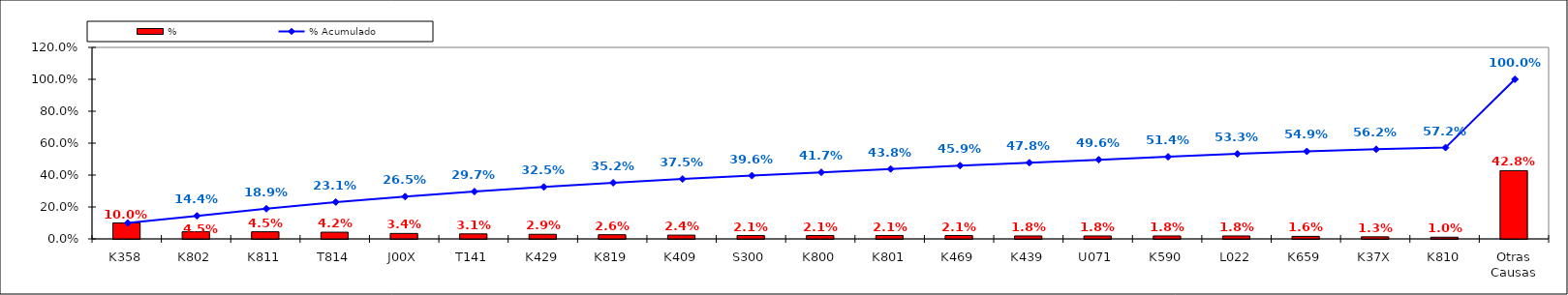
| Category | % |
|---|---|
| K358 | 0.1 |
| K802 | 0.045 |
| K811 | 0.045 |
| T814 | 0.042 |
| J00X | 0.034 |
| T141 | 0.031 |
| K429 | 0.029 |
| K819 | 0.026 |
| K409 | 0.024 |
| S300 | 0.021 |
| K800 | 0.021 |
| K801 | 0.021 |
| K469 | 0.021 |
| K439 | 0.018 |
| U071 | 0.018 |
| K590 | 0.018 |
| L022 | 0.018 |
| K659 | 0.016 |
| K37X | 0.013 |
| K810 | 0.01 |
| Otras Causas | 0.428 |